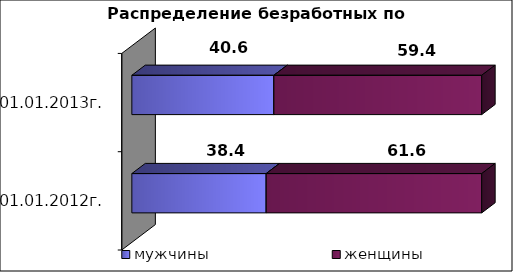
| Category | мужчины  | женщины  |
|---|---|---|
| на 01.01.2012г. | 38.4 | 61.6 |
| на 01.01.2013г. | 40.6 | 59.4 |